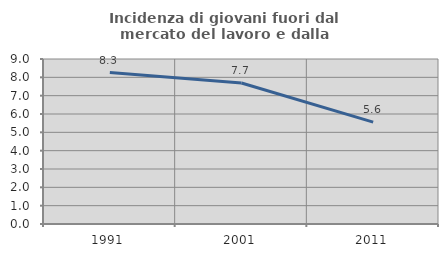
| Category | Incidenza di giovani fuori dal mercato del lavoro e dalla formazione  |
|---|---|
| 1991.0 | 8.26 |
| 2001.0 | 7.692 |
| 2011.0 | 5.556 |